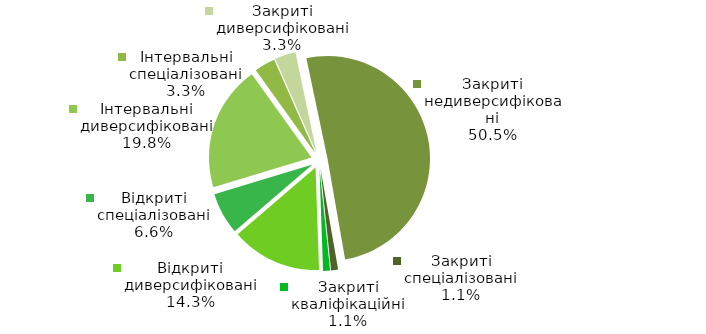
| Category | Series 0 |
|---|---|
| Відкриті диверсифіковані | 13 |
| Відкриті спеціалізовані | 6 |
| Інтервальні диверсифіковані | 18 |
| Інтервальні спеціалізовані | 3 |
| Закриті диверсифіковані | 3 |
| Закриті недиверсифіковані | 46 |
| Закриті спеціалізовані | 1 |
| Закриті кваліфікаційні | 1 |